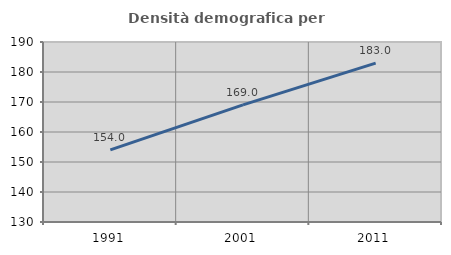
| Category | Densità demografica |
|---|---|
| 1991.0 | 154.031 |
| 2001.0 | 169.049 |
| 2011.0 | 182.973 |